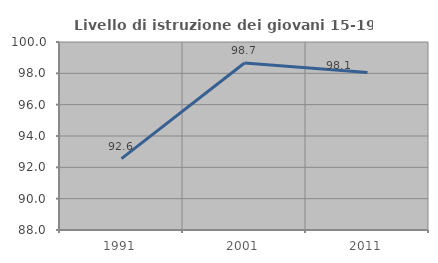
| Category | Livello di istruzione dei giovani 15-19 anni |
|---|---|
| 1991.0 | 92.553 |
| 2001.0 | 98.661 |
| 2011.0 | 98.054 |